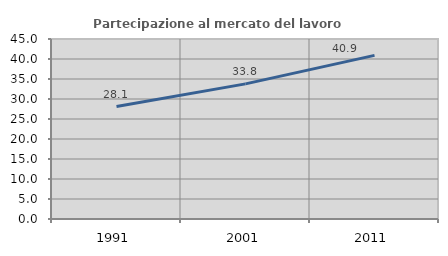
| Category | Partecipazione al mercato del lavoro  femminile |
|---|---|
| 1991.0 | 28.125 |
| 2001.0 | 33.78 |
| 2011.0 | 40.898 |